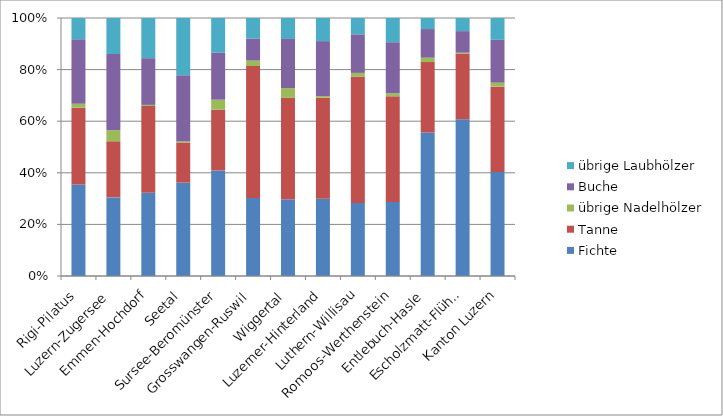
| Category | Fichte | Tanne | übrige Nadelhölzer | Buche | übrige Laubhölzer |
|---|---|---|---|---|---|
| Rigi-Pilatus | 149 | 125.1 | 6.3 | 105 | 34.7 |
| Luzern-Zugersee | 104.1 | 74.3 | 14.6 | 100.9 | 47.7 |
| Emmen-Hochdorf | 112.9 | 117.8 | 1.5 | 63.4 | 54.5 |
| Seetal | 159.5 | 68.7 | 2.2 | 112.8 | 97.7 |
| Sursee-Beromünster | 145.9 | 84.1 | 13.7 | 64.8 | 48.1 |
| Grosswangen-Ruswil | 120.7 | 204.7 | 8.4 | 34.3 | 31.7 |
| Wiggertal | 112.2 | 149 | 14.3 | 72.1 | 30.7 |
| Luzerner-Hinterland | 122.9 | 160.9 | 2.6 | 87.4 | 36.8 |
| Luthern-Willisau | 119.4 | 206.5 | 6 | 63 | 26.7 |
| Romoos-Werthenstein | 120.9 | 172.3 | 5 | 83.4 | 39.5 |
| Entlebuch-Hasle | 218.1 | 107.3 | 6.6 | 43.6 | 16.8 |
| Escholzmatt-Flühli | 240.3 | 100.6 | 1.3 | 33.1 | 20.1 |
| Kanton Luzern | 160.4 | 131.4 | 6.1 | 66 | 33.7 |